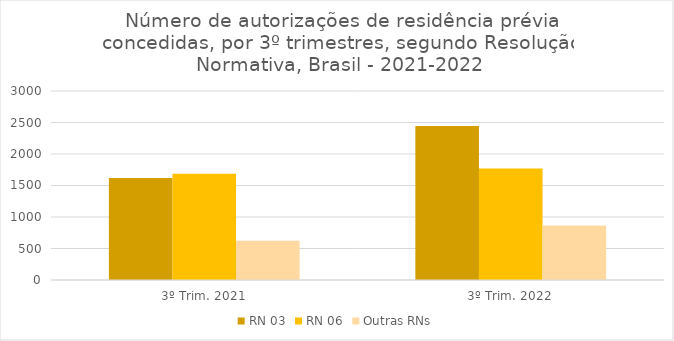
| Category | RN 03 | RN 06 | Outras RNs |
|---|---|---|---|
| 3º Trim. 2021 | 1621 | 1688 | 624 |
| 3º Trim. 2022 | 2443 | 1768 | 864 |